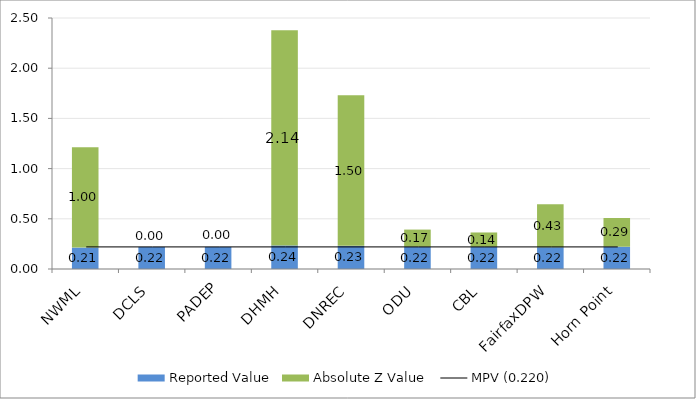
| Category | Reported Value | Absolute Z Value  |
|---|---|---|
| NWML | 0.213 | 1 |
| DCLS | 0.22 | 0 |
| PADEP | 0.22 | 0 |
| DHMH | 0.235 | 2.143 |
| DNREC | 0.23 | 1.5 |
| ODU | 0.221 | 0.171 |
| CBL | 0.221 | 0.143 |
| FairfaxDPW | 0.217 | 0.429 |
| Horn Point | 0.222 | 0.286 |